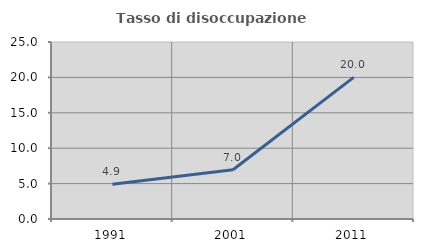
| Category | Tasso di disoccupazione giovanile  |
|---|---|
| 1991.0 | 4.918 |
| 2001.0 | 6.957 |
| 2011.0 | 20 |